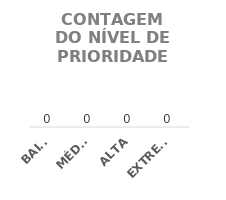
| Category | QTD. |
|---|---|
| BAIXA | 0 |
| MÉDIA | 0 |
| ALTA | 0 |
| EXTREMA | 0 |